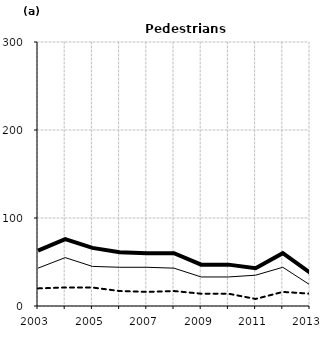
| Category | Built-up | Non built-up | Total |
|---|---|---|---|
| 2003.0 | 43 | 20 | 63 |
| 2004.0 | 55 | 21 | 76 |
| 2005.0 | 45 | 21 | 66 |
| 2006.0 | 44 | 17 | 61 |
| 2007.0 | 44 | 16 | 60 |
| 2008.0 | 43 | 17 | 60 |
| 2009.0 | 33 | 14 | 47 |
| 2010.0 | 33 | 14 | 47 |
| 2011.0 | 35 | 8 | 43 |
| 2012.0 | 44 | 16 | 60 |
| 2013.0 | 24 | 14 | 38 |